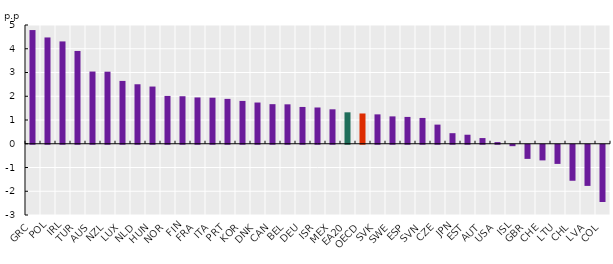
| Category | Employment rate |
|---|---|
| GRC | 4.787 |
| POL | 4.475 |
| IRL | 4.309 |
| TUR | 3.907 |
| AUS | 3.041 |
| NZL | 3.034 |
| LUX | 2.646 |
| NLD | 2.505 |
| HUN | 2.409 |
| NOR | 2.014 |
| FIN | 2.001 |
| FRA | 1.95 |
| ITA | 1.939 |
| PRT | 1.889 |
| KOR | 1.804 |
| DNK | 1.736 |
| CAN | 1.667 |
| BEL | 1.66 |
| DEU | 1.549 |
| ISR | 1.527 |
| MEX | 1.45 |
| EA20 | 1.324 |
| OECD | 1.274 |
| SVK | 1.237 |
| SWE | 1.152 |
| ESP | 1.13 |
| SVN | 1.086 |
| CZE | 0.806 |
| JPN | 0.445 |
| EST | 0.38 |
| AUT | 0.239 |
| USA | 0.069 |
| ISL | -0.06 |
| GBR | -0.595 |
| CHE | -0.658 |
| LTU | -0.806 |
| CHL | -1.516 |
| LVA | -1.733 |
| COL | -2.41 |